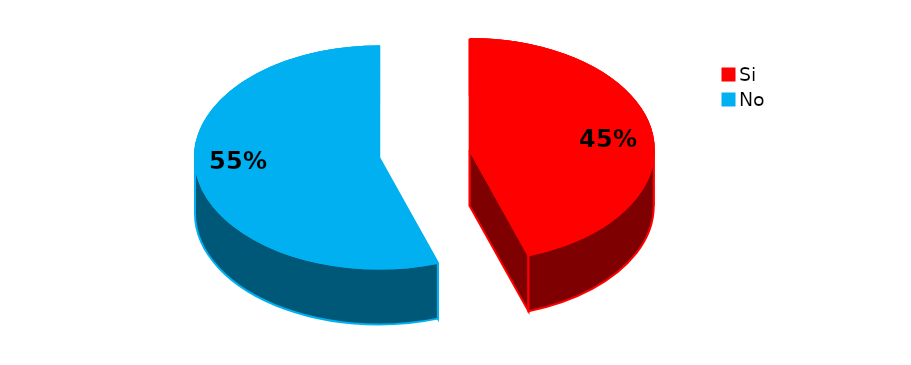
| Category | Series 0 |
|---|---|
| Si | 26 |
| No | 32 |